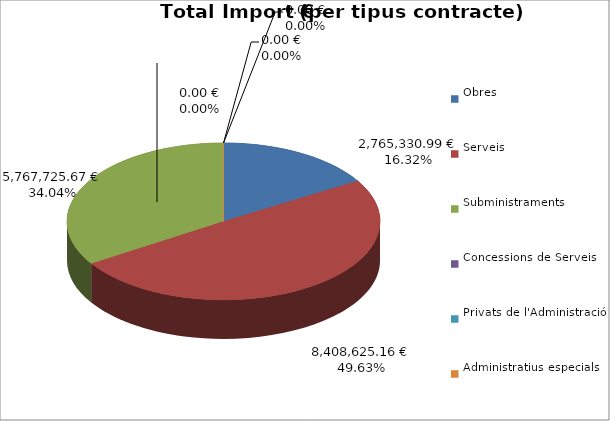
| Category | Total preu
(amb IVA) |
|---|---|
| Obres | 2765330.987 |
| Serveis | 8408625.156 |
| Subministraments | 5767725.674 |
| Concessions de Serveis | 0 |
| Privats de l'Administració | 0 |
| Administratius especials | 0 |